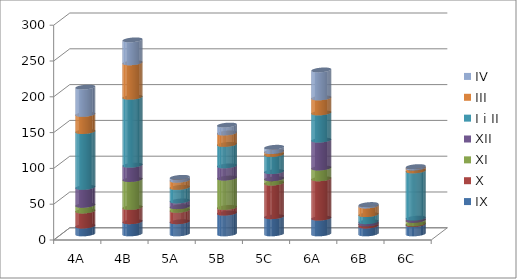
| Category | IX | X  | XI | XII | I i II | III | IV |
|---|---|---|---|---|---|---|---|
| 4A | 11 | 21 | 8 | 25 | 78 | 24 | 38 |
| 4B | 17 | 20 | 39 | 20 | 95 | 48 | 32 |
| 5A | 17 | 16 | 5 | 8 | 19 | 10 | 4 |
| 5B | 29 | 8 | 41 | 17 | 30 | 16 | 11 |
| 5C | 24 | 47 | 6 | 10 | 24 | 4 | 6 |
| 6A | 22 | 55 | 15 | 39 | 38 | 21 | 39 |
| 6B | 11 | 3 | 0 | 3 | 10 | 12 | 2 |
| 6C | 13 | 1 | 5 | 3 | 66 | 4 | 2 |